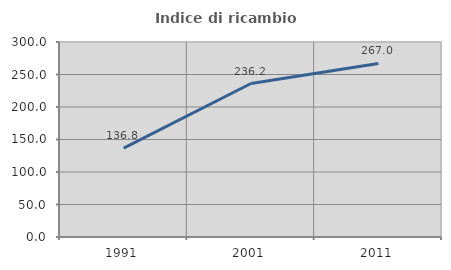
| Category | Indice di ricambio occupazionale  |
|---|---|
| 1991.0 | 136.824 |
| 2001.0 | 236.15 |
| 2011.0 | 266.972 |